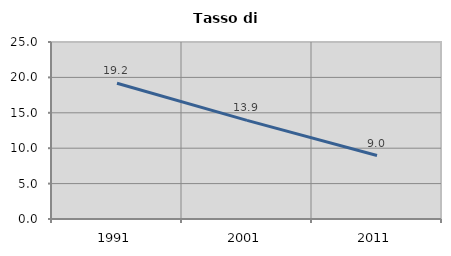
| Category | Tasso di disoccupazione   |
|---|---|
| 1991.0 | 19.178 |
| 2001.0 | 13.93 |
| 2011.0 | 8.962 |